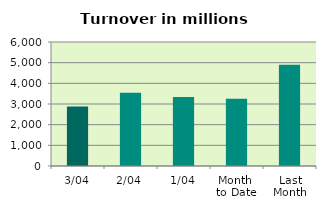
| Category | Series 0 |
|---|---|
| 3/04 | 2881.052 |
| 2/04 | 3546.905 |
| 1/04 | 3342.886 |
| Month 
to Date | 3256.947 |
| Last
Month | 4897.629 |